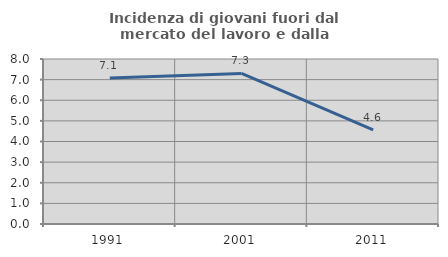
| Category | Incidenza di giovani fuori dal mercato del lavoro e dalla formazione  |
|---|---|
| 1991.0 | 7.075 |
| 2001.0 | 7.302 |
| 2011.0 | 4.56 |